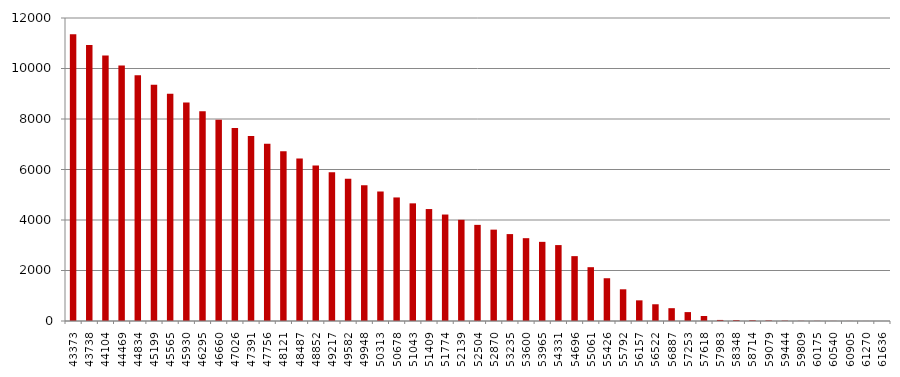
| Category | Series 0 |
|---|---|
| 43373.0 | 11353.823 |
| 43738.0 | 10930.259 |
| 44104.0 | 10515.534 |
| 44469.0 | 10115.76 |
| 44834.0 | 9730.503 |
| 45199.0 | 9358.972 |
| 45565.0 | 8998.997 |
| 45930.0 | 8648.686 |
| 46295.0 | 8306.694 |
| 46660.0 | 7971.686 |
| 47026.0 | 7644.789 |
| 47391.0 | 7327.526 |
| 47756.0 | 7020.452 |
| 48121.0 | 6721.924 |
| 48487.0 | 6435.645 |
| 48852.0 | 6163.223 |
| 49217.0 | 5893.217 |
| 49582.0 | 5630.009 |
| 49948.0 | 5375.349 |
| 50313.0 | 5129.923 |
| 50678.0 | 4893.212 |
| 51043.0 | 4659.522 |
| 51409.0 | 4433.535 |
| 51774.0 | 4216.533 |
| 52139.0 | 4007.727 |
| 52504.0 | 3807.253 |
| 52870.0 | 3618.114 |
| 53235.0 | 3442.032 |
| 53600.0 | 3280.011 |
| 53965.0 | 3134.636 |
| 54331.0 | 3006.545 |
| 54696.0 | 2568.823 |
| 55061.0 | 2131.101 |
| 55426.0 | 1693.379 |
| 55792.0 | 1255.656 |
| 56157.0 | 817.934 |
| 56522.0 | 662.775 |
| 56887.0 | 507.617 |
| 57253.0 | 352.458 |
| 57618.0 | 197.3 |
| 57983.0 | 42.141 |
| 58348.0 | 35.012 |
| 58714.0 | 27.883 |
| 59079.0 | 20.753 |
| 59444.0 | 13.624 |
| 59809.0 | 6.495 |
| 60175.0 | 5.196 |
| 60540.0 | 3.897 |
| 60905.0 | 2.598 |
| 61270.0 | 1.299 |
| 61636.0 | 0 |